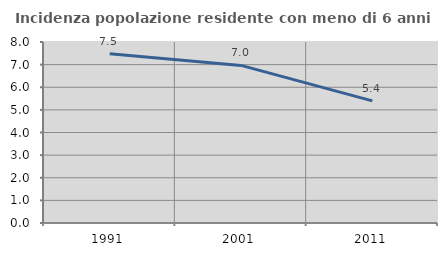
| Category | Incidenza popolazione residente con meno di 6 anni |
|---|---|
| 1991.0 | 7.481 |
| 2001.0 | 6.965 |
| 2011.0 | 5.397 |